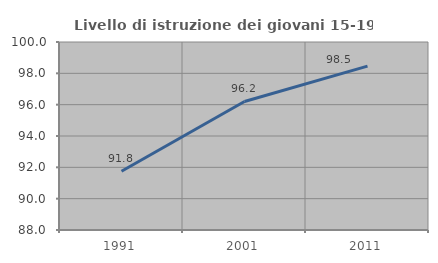
| Category | Livello di istruzione dei giovani 15-19 anni |
|---|---|
| 1991.0 | 91.751 |
| 2001.0 | 96.203 |
| 2011.0 | 98.462 |